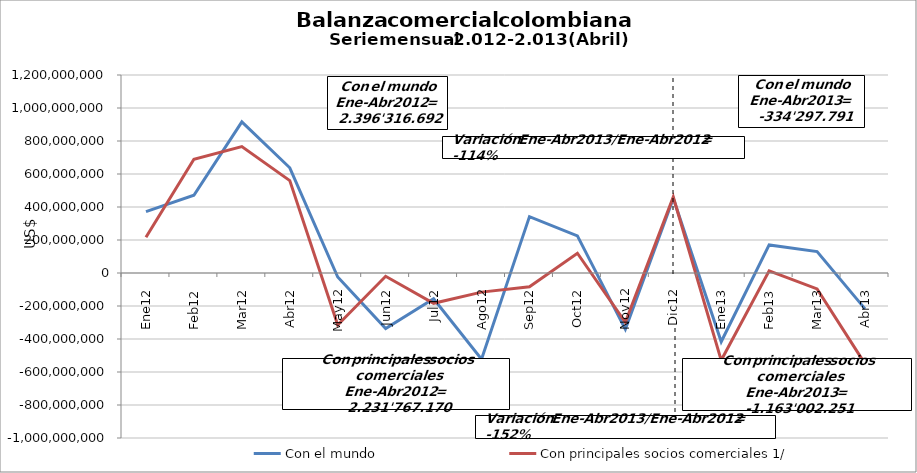
| Category | Con el mundo | Con principales socios comerciales 1/ |
|---|---|---|
| 0 | 371588601.84 | 216142905.42 |
| 1 | 471109607.31 | 689487942.12 |
| 2 | 915911670.59 | 766078708.42 |
| 3 | 637706812.67 | 560057614.32 |
| 4 | -24278377.48 | -315408438.7 |
| 5 | -336582158.92 | -19931390.37 |
| 6 | -156141093.75 | -183648990.01 |
| 7 | -522487753.65 | -115939391.32 |
| 8 | 341551791.65 | -82918306.95 |
| 9 | 224887257.5 | 119662551.4 |
| 10 | -341510254.09 | -299434123.66 |
| 11 | 452349103.5 | 460335173.91 |
| 12 | -416629494.45 | -529231489.85 |
| 13 | 170276250.68 | 13433655.4 |
| 14 | 129706117.85 | -96355650.36 |
| 15 | -217650665.27 | -550848766.34 |